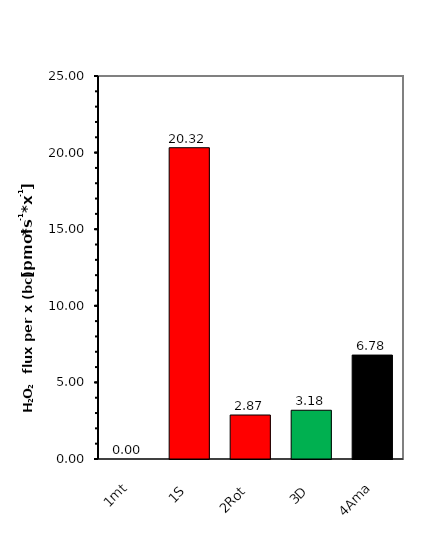
| Category | 0.00 |
|---|---|
| 1mt | 0 |
| 1S | 20.319 |
| 2Rot | 2.872 |
| 3D | 3.181 |
| 4Ama | 6.783 |